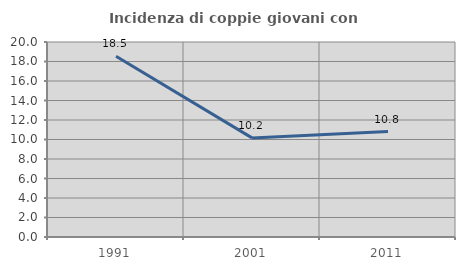
| Category | Incidenza di coppie giovani con figli |
|---|---|
| 1991.0 | 18.533 |
| 2001.0 | 10.164 |
| 2011.0 | 10.817 |